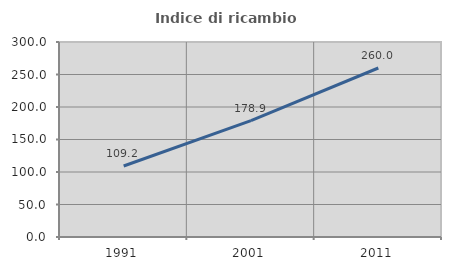
| Category | Indice di ricambio occupazionale  |
|---|---|
| 1991.0 | 109.231 |
| 2001.0 | 178.947 |
| 2011.0 | 260 |